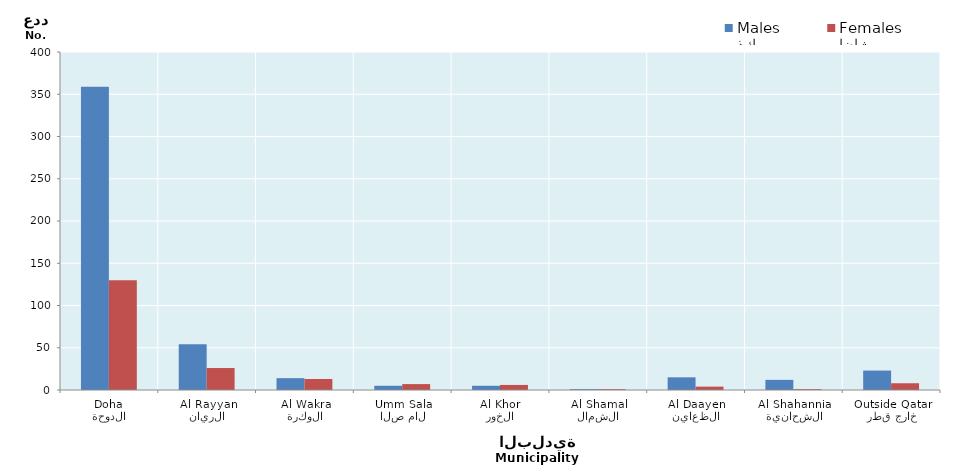
| Category | ذكور
Males | إناث
Females |
|---|---|---|
| الدوحة
Doha | 359 | 130 |
| الريان
Al Rayyan | 54 | 26 |
| الوكرة
Al Wakra | 14 | 13 |
| ام صلال
Umm Salal | 5 | 7 |
| الخور
Al Khor | 5 | 6 |
| الشمال
Al Shamal | 1 | 1 |
| الظعاين
Al Daayen | 15 | 4 |
| الشحانية
Al Shahannia | 12 | 1 |
| خارج قطر
Outside Qatar | 23 | 8 |